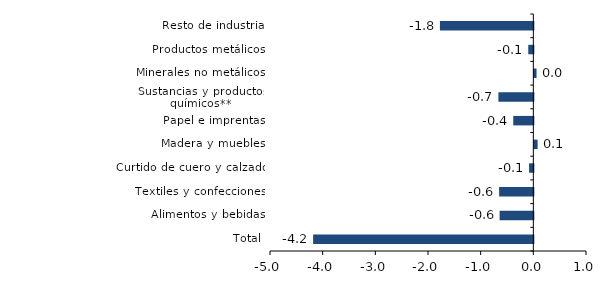
| Category | Series 0 |
|---|---|
| Total | -4.181 |
| Alimentos y bebidas | -0.64 |
| Textiles y confecciones | -0.65 |
| Curtido de cuero y calzado | -0.081 |
| Madera y muebles | 0.062 |
| Papel e imprentas | -0.381 |
| Sustancias y productos químicos** | -0.664 |
| Minerales no metálicos | 0.042 |
| Productos metálicos | -0.096 |
| Resto de industria | -1.774 |